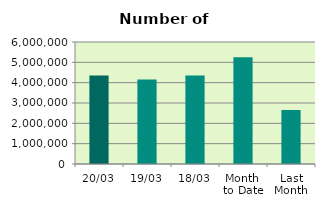
| Category | Series 0 |
|---|---|
| 20/03 | 4355904 |
| 19/03 | 4159428 |
| 18/03 | 4348238 |
| Month 
to Date | 5255479.867 |
| Last
Month | 2656039 |